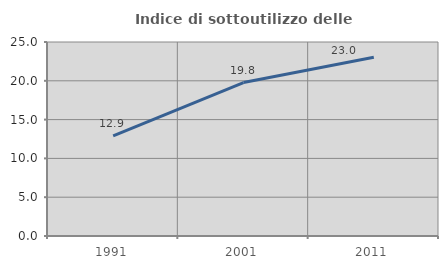
| Category | Indice di sottoutilizzo delle abitazioni  |
|---|---|
| 1991.0 | 12.914 |
| 2001.0 | 19.775 |
| 2011.0 | 23.033 |